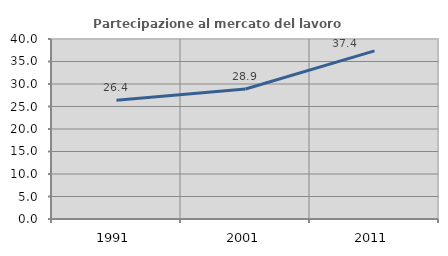
| Category | Partecipazione al mercato del lavoro  femminile |
|---|---|
| 1991.0 | 26.377 |
| 2001.0 | 28.889 |
| 2011.0 | 37.357 |